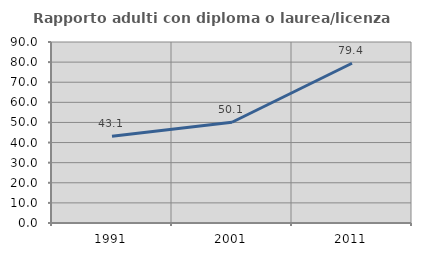
| Category | Rapporto adulti con diploma o laurea/licenza media  |
|---|---|
| 1991.0 | 43.135 |
| 2001.0 | 50.088 |
| 2011.0 | 79.439 |